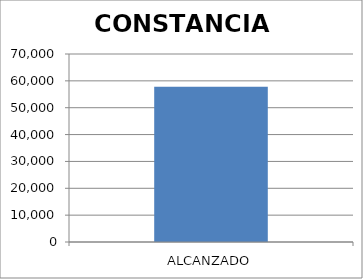
| Category | CONSTANCIAS  |
|---|---|
| ALCANZADO | 57816 |